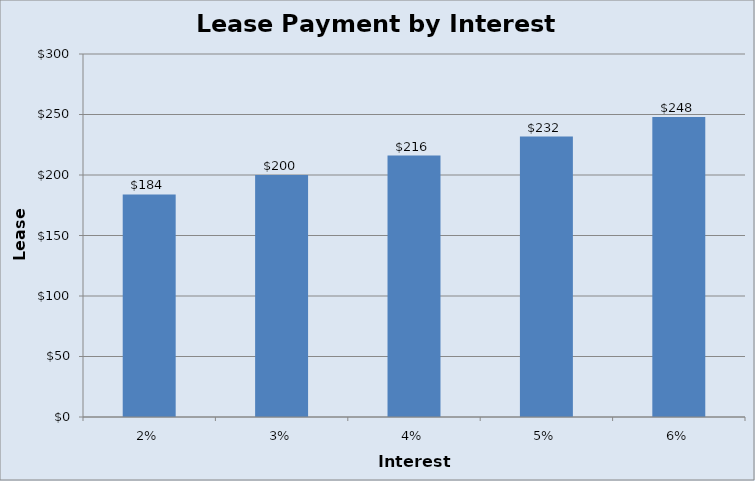
| Category | Lease Payment |
|---|---|
| 0.02 | 183.893 |
| 0.03 | 199.99 |
| 0.04 | 216.086 |
| 0.05 | 231.799 |
| 0.06 | 247.896 |